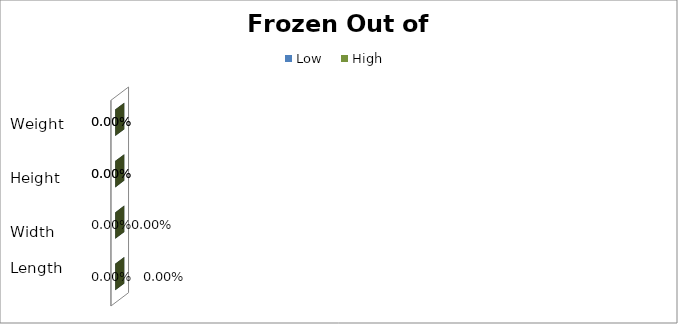
| Category | Low | High |
|---|---|---|
| 0 | 0 | 0 |
| 1 | 0 | 0 |
| 2 | 0 | 0 |
| 3 | 0 | 0 |